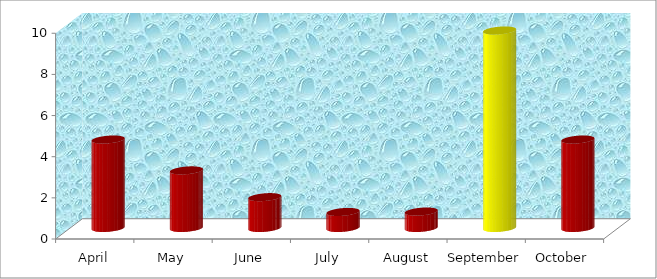
| Category | Series 0 |
|---|---|
| April | 4.3 |
| May | 2.8 |
| June | 1.5 |
| July | 0.78 |
| August | 0.8 |
| September | 9.6 |
| October | 4.3 |